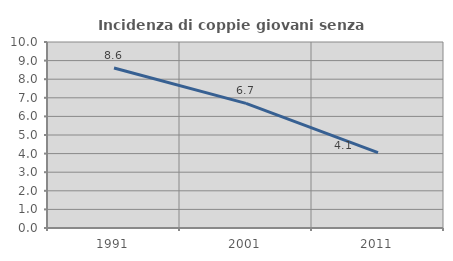
| Category | Incidenza di coppie giovani senza figli |
|---|---|
| 1991.0 | 8.6 |
| 2001.0 | 6.698 |
| 2011.0 | 4.057 |